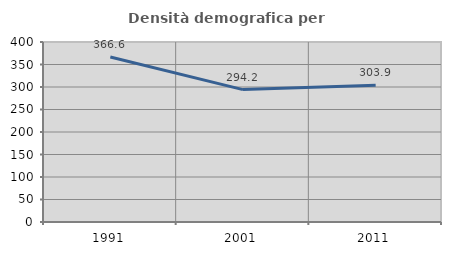
| Category | Densità demografica |
|---|---|
| 1991.0 | 366.602 |
| 2001.0 | 294.176 |
| 2011.0 | 303.904 |